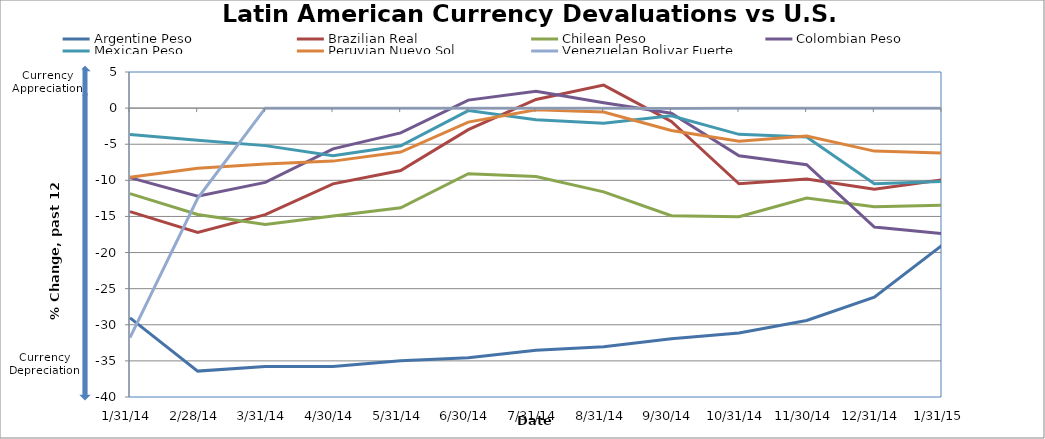
| Category | Argentine Peso | Brazilian Real | Chilean Peso | Colombian Peso | Mexican Peso | Peruvian Nuevo Sol | Venezuelan Bolivar Fuerte |
|---|---|---|---|---|---|---|---|
| 1/31/14 | -29.038 | -14.337 | -11.848 | -9.628 | -3.661 | -9.581 | -31.784 |
| 2/28/14 | -36.415 | -17.215 | -14.721 | -12.183 | -4.447 | -8.33 | -12.492 |
| 3/31/14 | -35.76 | -14.753 | -16.12 | -10.284 | -5.193 | -7.722 | -0.014 |
| 4/30/14 | -35.782 | -10.486 | -14.953 | -5.637 | -6.585 | -7.339 | -0.013 |
| 5/31/14 | -34.973 | -8.634 | -13.796 | -3.431 | -5.209 | -6.077 | -0.021 |
| 6/30/14 | -34.578 | -2.99 | -9.078 | 1.108 | -0.349 | -1.937 | -0.013 |
| 7/31/14 | -33.518 | 1.2 | -9.463 | 2.33 | -1.609 | -0.237 | -0.016 |
| 8/31/14 | -33.05 | 3.186 | -11.596 | 0.729 | -2.096 | -0.534 | -0.008 |
| 9/30/14 | -31.928 | -1.846 | -14.906 | -0.706 | -1.059 | -3.101 | -0.059 |
| 10/31/14 | -31.13 | -10.483 | -15.045 | -6.587 | -3.636 | -4.593 | -0.029 |
| 11/30/14 | -29.412 | -9.819 | -12.445 | -7.843 | -4.006 | -3.873 | -0.017 |
| 12/31/14 | -26.191 | -11.236 | -13.671 | -16.469 | -10.458 | -5.952 | -0.024 |
| 1/31/15 | -19.001 | -9.946 | -13.451 | -17.359 | -10.169 | -6.204 | -0.024 |